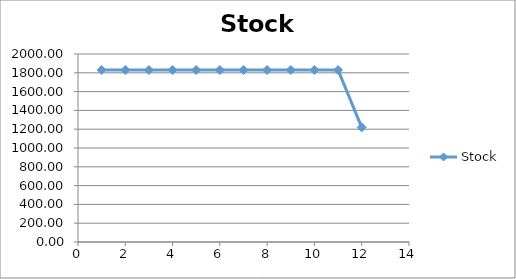
| Category | Stock |
|---|---|
| 0 | 1829.72 |
| 1 | 1829.72 |
| 2 | 1829.72 |
| 3 | 1829.72 |
| 4 | 1829.72 |
| 5 | 1829.72 |
| 6 | 1829.72 |
| 7 | 1829.72 |
| 8 | 1829.72 |
| 9 | 1829.72 |
| 10 | 1829.72 |
| 11 | 1219.81 |